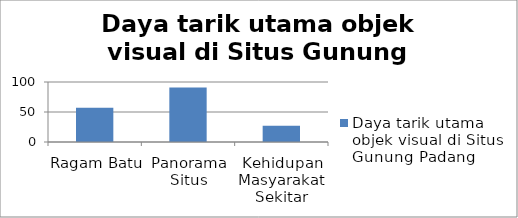
| Category | Daya tarik utama objek visual di Situs Gunung Padang |
|---|---|
| Ragam Batu | 57 |
| Panorama Situs | 91 |
| Kehidupan Masyarakat Sekitar | 27 |